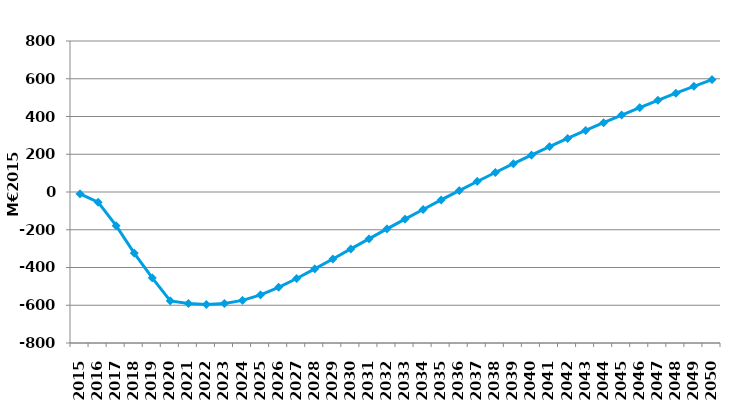
| Category | Series 0 |
|---|---|
| 2015.0 | -9.627 |
| 2016.0 | -54.022 |
| 2017.0 | -178.557 |
| 2018.0 | -324.061 |
| 2019.0 | -454.58 |
| 2020.0 | -577.005 |
| 2021.0 | -590.589 |
| 2022.0 | -595.652 |
| 2023.0 | -590.664 |
| 2024.0 | -574.369 |
| 2025.0 | -545.012 |
| 2026.0 | -505.124 |
| 2027.0 | -458.207 |
| 2028.0 | -407.285 |
| 2029.0 | -354.753 |
| 2030.0 | -301.61 |
| 2031.0 | -248.392 |
| 2032.0 | -195.678 |
| 2033.0 | -143.705 |
| 2034.0 | -92.474 |
| 2035.0 | -42.12 |
| 2036.0 | 7.234 |
| 2037.0 | 55.695 |
| 2038.0 | 103.237 |
| 2039.0 | 149.87 |
| 2040.0 | 195.492 |
| 2041.0 | 240.044 |
| 2042.0 | 283.539 |
| 2043.0 | 325.994 |
| 2044.0 | 367.428 |
| 2045.0 | 407.861 |
| 2046.0 | 447.309 |
| 2047.0 | 485.793 |
| 2048.0 | 523.332 |
| 2049.0 | 559.946 |
| 2050.0 | 595.654 |